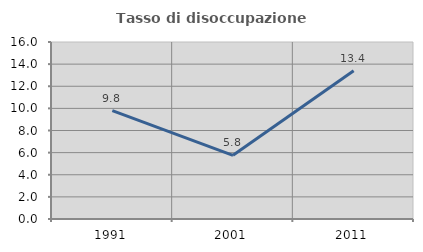
| Category | Tasso di disoccupazione giovanile  |
|---|---|
| 1991.0 | 9.795 |
| 2001.0 | 5.758 |
| 2011.0 | 13.408 |